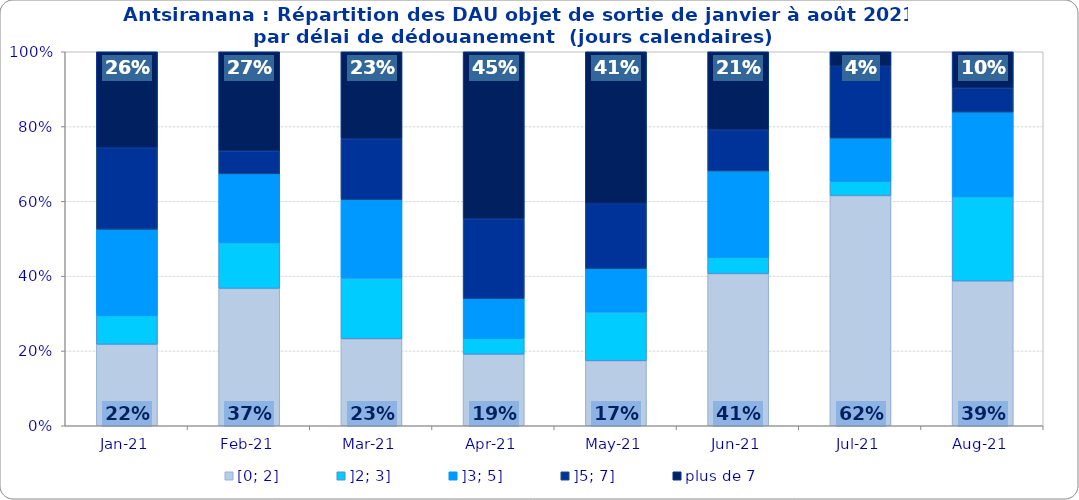
| Category | [0; 2] | ]2; 3] | ]3; 5] | ]5; 7] | plus de 7 |
|---|---|---|---|---|---|
| 2021-01-01 | 0.218 | 0.077 | 0.231 | 0.218 | 0.256 |
| 2021-02-01 | 0.367 | 0.122 | 0.184 | 0.061 | 0.265 |
| 2021-03-01 | 0.233 | 0.163 | 0.209 | 0.163 | 0.233 |
| 2021-04-01 | 0.191 | 0.043 | 0.106 | 0.213 | 0.447 |
| 2021-05-01 | 0.174 | 0.13 | 0.116 | 0.174 | 0.406 |
| 2021-06-01 | 0.407 | 0.044 | 0.231 | 0.11 | 0.209 |
| 2021-07-01 | 0.615 | 0.038 | 0.115 | 0.192 | 0.038 |
| 2021-08-01 | 0.387 | 0.226 | 0.226 | 0.065 | 0.097 |